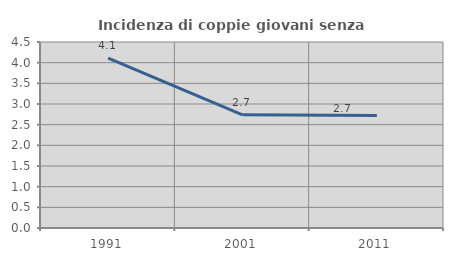
| Category | Incidenza di coppie giovani senza figli |
|---|---|
| 1991.0 | 4.11 |
| 2001.0 | 2.74 |
| 2011.0 | 2.721 |